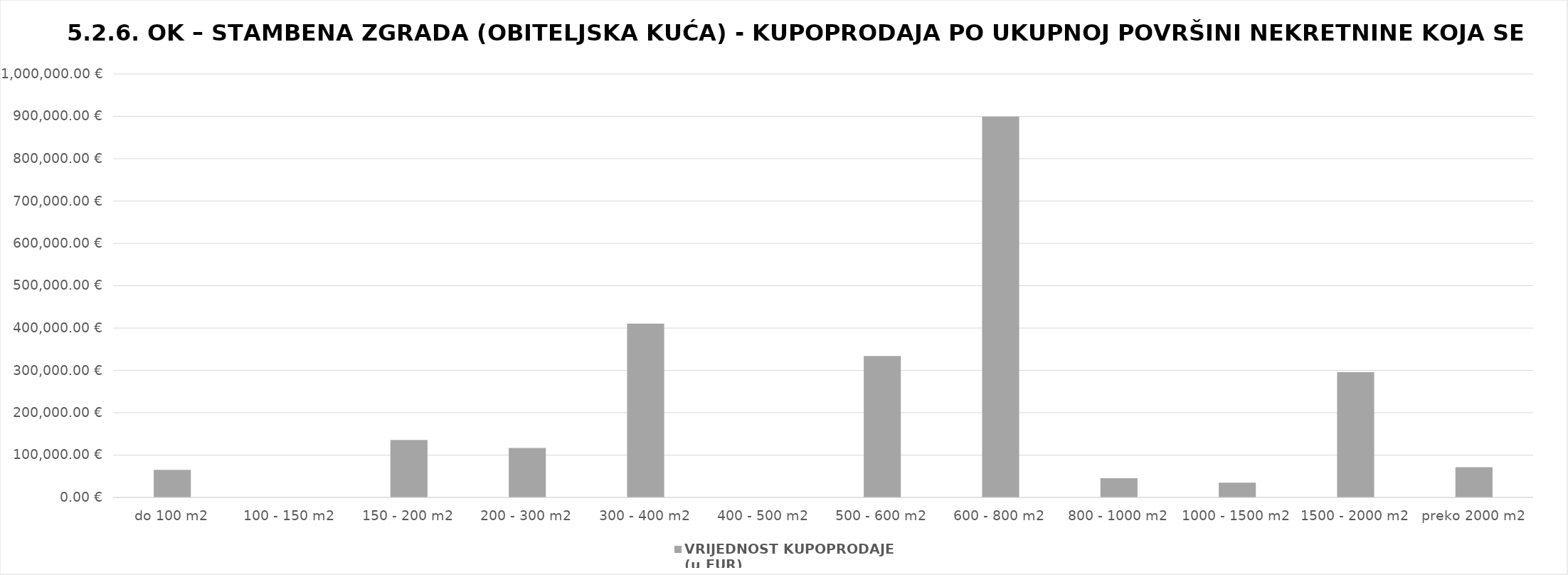
| Category | VRIJEDNOST KUPOPRODAJE   
(u EUR) |
|---|---|
| do 100 m2 | 65151.834 |
| 100 - 150 m2 | 0 |
| 150 - 200 m2 | 135585.868 |
| 200 - 300 m2 | 116835.334 |
| 300 - 400 m2 | 410323.484 |
| 400 - 500 m2 | 0 |
| 500 - 600 m2 | 334165.103 |
| 600 - 800 m2 | 899042.658 |
| 800 - 1000 m2 | 45476.701 |
| 1000 - 1500 m2 | 35033.155 |
| 1500 - 2000 m2 | 295739.803 |
| preko 2000 m2 | 71512.439 |